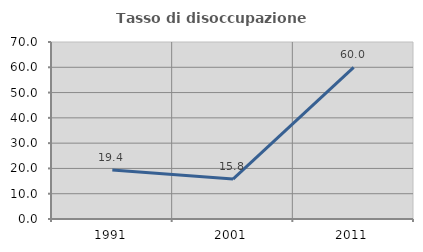
| Category | Tasso di disoccupazione giovanile  |
|---|---|
| 1991.0 | 19.355 |
| 2001.0 | 15.789 |
| 2011.0 | 60 |